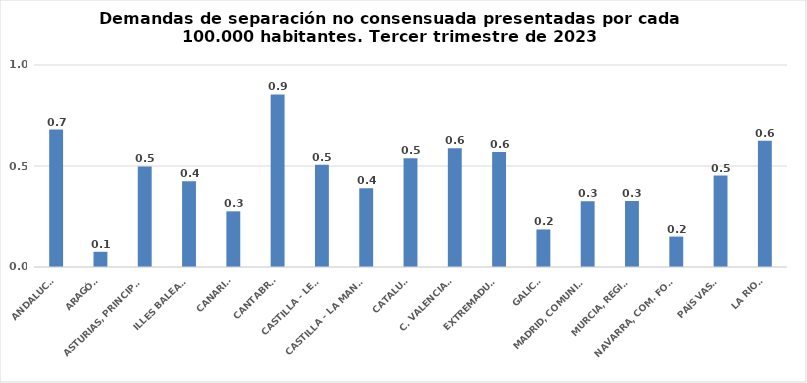
| Category | Series 0 |
|---|---|
| ANDALUCÍA | 0.681 |
| ARAGÓN | 0.075 |
| ASTURIAS, PRINCIPADO | 0.498 |
| ILLES BALEARS | 0.425 |
| CANARIAS | 0.276 |
| CANTABRIA | 0.854 |
| CASTILLA - LEÓN | 0.506 |
| CASTILLA - LA MANCHA | 0.39 |
| CATALUÑA | 0.539 |
| C. VALENCIANA | 0.588 |
| EXTREMADURA | 0.569 |
| GALICIA | 0.186 |
| MADRID, COMUNIDAD | 0.326 |
| MURCIA, REGIÓN | 0.326 |
| NAVARRA, COM. FORAL | 0.151 |
| PAÍS VASCO | 0.453 |
| LA RIOJA | 0.625 |